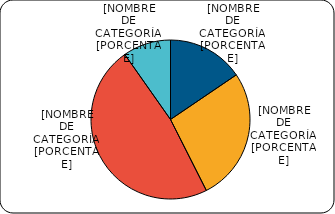
| Category | Series 0 |
|---|---|
| Menores de 3% | 2095.6 |
| Entre 3% y 6% | 3651.9 |
| Entre 6% y 8% | 6441.4 |
| Entre 8% y 9% | 1317.4 |